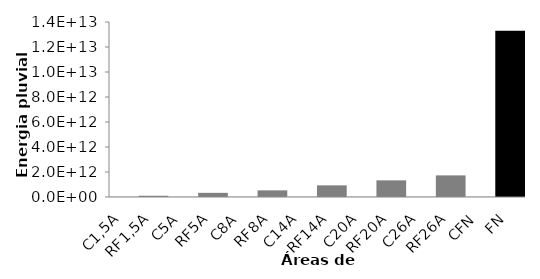
| Category | Series 0 |
|---|---|
| C1,5A | 66541800000 |
| RF1,5A | 99812700000 |
| C5A | 66541800000 |
| RF5A | 332709000000 |
| C8A | 66541800000 |
| RF8A | 532334400000 |
| C14A | 66541800000 |
| RF14A | 931585200000 |
| C20A | 66541800000 |
| RF20A | 1330836000000 |
| C26A | 66541800000 |
| RF26A | 1730086800000 |
| CFN | 66541800000 |
| FN | 13308360000000 |